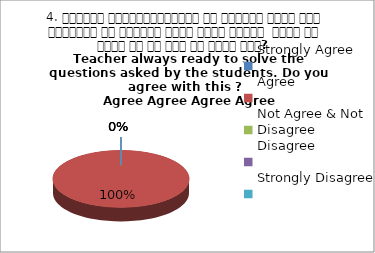
| Category | 4. शिक्षक विद्यार्थियों के द्वारा पूछे गये प्रश्नो का समाधान करने हेतु तत्पर  रहते है क्या आप इस बात से सहमत हैं? 
 Teacher always ready to solve the questions asked by the students. Do you agree with this ? 
 Agree Agree Agree Agree |
|---|---|
| Strongly Agree | 0 |
| Agree | 4 |
| Not Agree & Not Disagree | 0 |
| Disagree | 0 |
| Strongly Disagree | 0 |